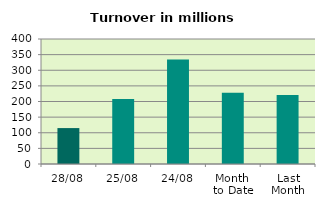
| Category | Series 0 |
|---|---|
| 28/08 | 114.932 |
| 25/08 | 207.723 |
| 24/08 | 334.361 |
| Month 
to Date | 228.327 |
| Last
Month | 220.762 |